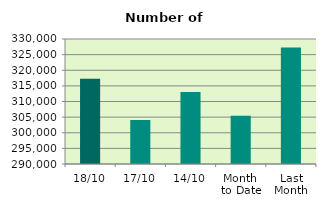
| Category | Series 0 |
|---|---|
| 18/10 | 317252 |
| 17/10 | 304080 |
| 14/10 | 313050 |
| Month 
to Date | 305460.667 |
| Last
Month | 327317.909 |